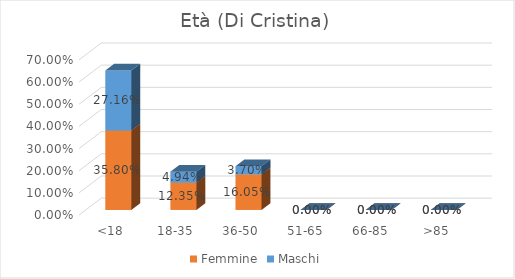
| Category | Femmine | Maschi |
|---|---|---|
| <18 | 0.358 | 0.272 |
| 18-35 | 0.123 | 0.049 |
| 36-50 | 0.16 | 0.037 |
| 51-65 | 0 | 0 |
| 66-85 | 0 | 0 |
| >85 | 0 | 0 |